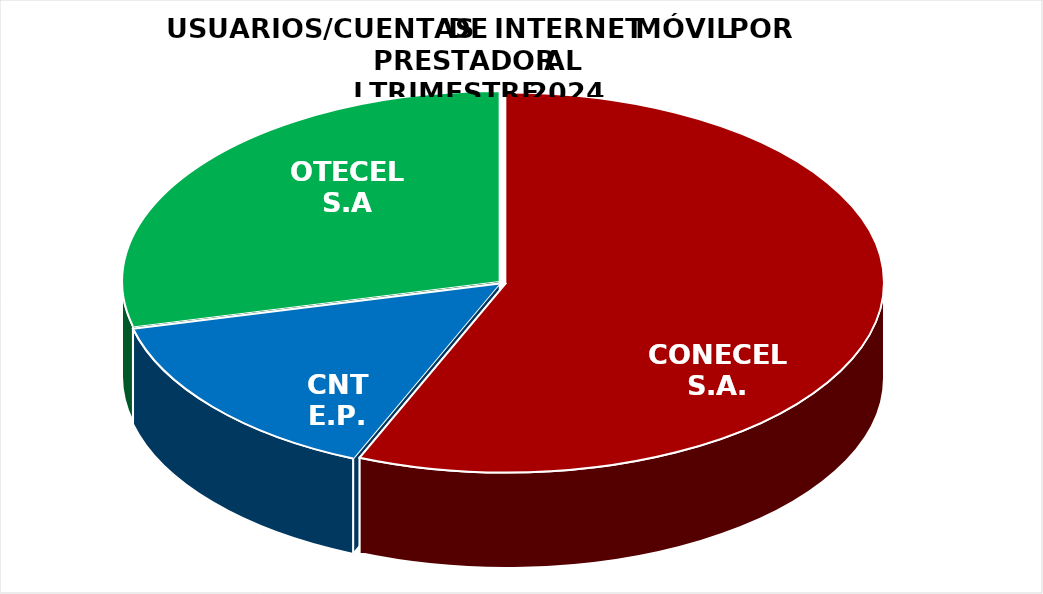
| Category | Series 0 |
|---|---|
| CONECEL S.A. | 6437046 |
| CNT E.P. | 1692334 |
| OTECEL S.A | 3294466 |